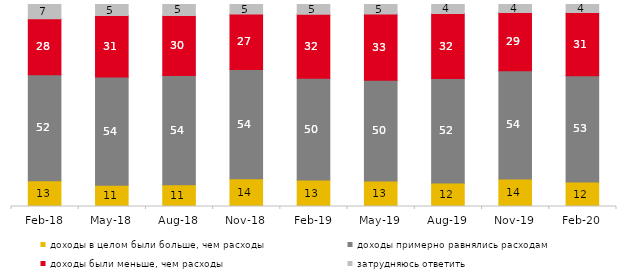
| Category | доходы в целом были больше, чем расходы | доходы примерно равнялись расходам | доходы были меньше, чем расходы | затрудняюсь ответить |
|---|---|---|---|---|
| 2018-02-01 | 12.75 | 52.3 | 27.75 | 7 |
| 2018-05-01 | 10.55 | 53.5 | 30.5 | 5.45 |
| 2018-08-01 | 10.75 | 54.05 | 29.8 | 5.4 |
| 2018-11-01 | 13.723 | 54.092 | 27.495 | 4.691 |
| 2019-02-01 | 13.1 | 50.4 | 31.65 | 4.85 |
| 2019-05-01 | 12.63 | 49.926 | 32.739 | 4.705 |
| 2019-08-01 | 11.688 | 51.648 | 32.218 | 4.446 |
| 2019-11-01 | 13.564 | 53.614 | 28.812 | 4.01 |
| 2020-02-01 | 12.079 | 52.673 | 31.238 | 4.01 |